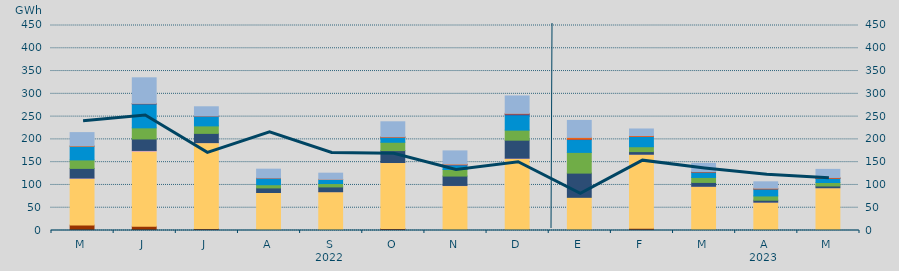
| Category | Carbón | Ciclo Combinado | Cogeneración | Consumo Bombeo | Eólica | Hidráulica | Nuclear | Otras Renovables | Solar fotovoltaica | Solar térmica | Turbinación bombeo |
|---|---|---|---|---|---|---|---|---|---|---|---|
| M | 11875.65 | 102430.975 | 928.85 | 21079.775 | 18647.725 | 29842.925 | 0 | 0 | 1098.75 | 0 | 29000.65 |
| J | 9138.825 | 164797.65 | 1808.4 | 25204.95 | 24371.3 | 52553.275 | 599.625 | 0 | 596 | 0 | 56106.775 |
| J | 4302 | 188455.5 | 190.325 | 20249.475 | 16437.65 | 21832.925 | 50 | 0 | 230.625 | 0 | 19818.55 |
| A | 2452.3 | 80908.85 | 69.8 | 10038.425 | 6983.45 | 14747.025 | 33 | 0 | 300.1 | 0 | 19076.4 |
| S | 2236 | 82926.675 | 23 | 10509.975 | 7386.425 | 8900.725 | 0 | 0 | 476.125 | 0 | 13369.775 |
| O | 4283 | 144842.475 | 127.925 | 26134.8 | 18277.325 | 11041.025 | 22.5 | 0 | 1111.175 | 0 | 32778.95 |
| N | 861.375 | 97623.7 | 419.15 | 20591.575 | 14440 | 9978.175 | 722.075 | 1 | 1239.075 | 0 | 28866.575 |
| D | 2372.95 | 155746.55 | 697.65 | 39478.975 | 22031.425 | 33537.4 | 2006.425 | 0 | 1334.875 | 0 | 38128.575 |
| E | 1284.5 | 71547.4 | 0 | 53164.775 | 45462.95 | 28173.35 | 832.7 | 0 | 3920.525 | 0 | 37262.825 |
| F | 5209.75 | 162258.025 | 4.5 | 5734.4 | 10650.1 | 22890.65 | 0 | 26 | 1697.2 | 0 | 14370.575 |
| M | 1206.25 | 95878.75 | 28.525 | 8412.525 | 10950.5 | 11649.375 | 291.075 | 0 | 997.65 | 0 | 18026.625 |
| A | 95 | 62173.25 | 34.425 | 4159.95 | 9407.775 | 15400.95 | 65.5 | 0 | 1513.55 | 0 | 13985.1 |
| M | 53 | 93854.15 | 22.625 | 3893.75 | 7479.975 | 9063.875 | 377.575 | 0 | 1716.575 | 0 | 17696.4 |